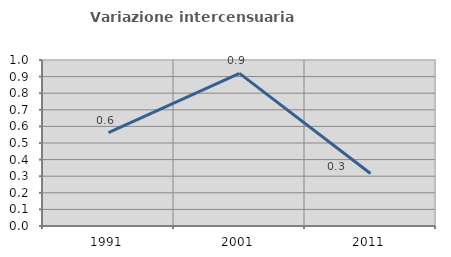
| Category | Variazione intercensuaria annua |
|---|---|
| 1991.0 | 0.563 |
| 2001.0 | 0.919 |
| 2011.0 | 0.316 |